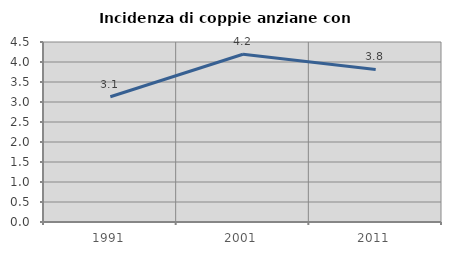
| Category | Incidenza di coppie anziane con figli |
|---|---|
| 1991.0 | 3.132 |
| 2001.0 | 4.193 |
| 2011.0 | 3.814 |